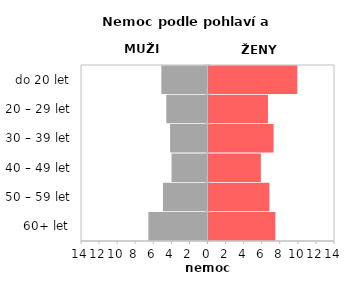
| Category | Nemoc |
|---|---|
| 60+ let | 7.4 |
| 50 – 59 let | 6.739 |
| 40 – 49 let | 5.795 |
| 30 – 39 let | 7.205 |
| 20 – 29 let | 6.581 |
| do 20 let | 9.832 |